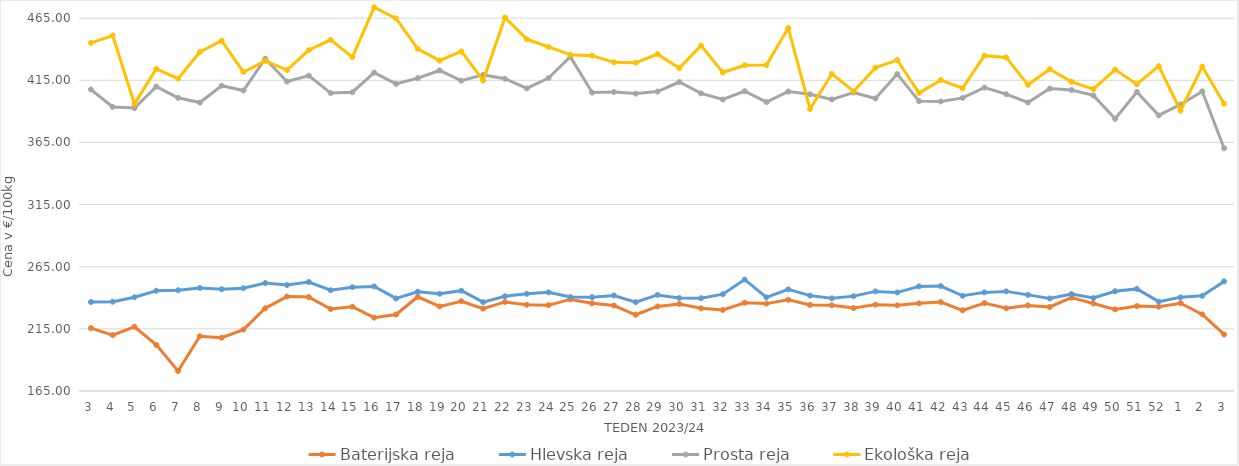
| Category | Baterijska reja | Hlevska reja | Prosta reja | Ekološka reja |
|---|---|---|---|---|
| 3.0 | 215.63 | 236.58 | 407.61 | 445.17 |
| 4.0 | 210 | 236.85 | 393.58 | 451.04 |
| 5.0 | 216.7 | 240.42 | 392.67 | 396.03 |
| 6.0 | 202.1 | 245.67 | 409.97 | 424.14 |
| 7.0 | 181.11 | 246.12 | 400.94 | 416.38 |
| 8.0 | 209.08 | 247.88 | 397.11 | 437.76 |
| 9.0 | 207.87 | 246.89 | 410.64 | 446.9 |
| 10.0 | 214.42 | 247.73 | 406.8 | 421.72 |
| 11.0 | 231.56 | 251.88 | 432.34 | 430.69 |
| 12.0 | 240.97 | 250.3 | 414 | 423.28 |
| 13.0 | 240.55 | 252.7 | 418.74 | 439.31 |
| 14.0 | 230.99 | 246.12 | 404.72 | 447.59 |
| 15.0 | 232.82 | 248.56 | 405.42 | 433.62 |
| 16.0 | 224 | 249.17 | 421.22 | 473.79 |
| 17.0 | 226.57 | 239.5 | 412.13 | 464.83 |
| 18.0 | 240.83 | 244.89 | 416.74 | 440.35 |
| 19.0 | 233.05 | 243.26 | 422.93 | 430.86 |
| 20.0 | 237.25 | 245.73 | 414.68 | 438.28 |
| 21.0 | 231.3 | 236.5 | 419.36 | 414.83 |
| 22.0 | 236.67 | 241.27 | 416.27 | 465.52 |
| 23.0 | 234.39 | 243.16 | 408.53 | 448.1 |
| 24.0 | 234.08 | 244.37 | 416.78 | 441.9 |
| 25.0 | 238.69 | 240.6 | 434.05 | 435.52 |
| 26.0 | 235.57 | 240.51 | 405.15 | 434.83 |
| 27.0 | 233.75 | 241.89 | 405.58 | 429.48 |
| 28.0 | 226.35 | 236.46 | 404.32 | 429.14 |
| 29.0 | 233.03 | 242.31 | 405.96 | 436.04 |
| 30.0 | 235 | 239.8 | 413.63 | 424.83 |
| 31.0 | 231.55 | 239.67 | 404.46 | 442.93 |
| 32.0 | 230.2 | 242.89 | 399.57 | 421.38 |
| 33.0 | 236.04 | 254.68 | 406.23 | 427.07 |
| 34.0 | 235.32 | 240.35 | 397.45 | 427.24 |
| 35.0 | 238.39 | 246.82 | 406 | 457.07 |
| 36.0 | 234.27 | 241.75 | 403.79 | 392.07 |
| 37.0 | 234 | 239.58 | 399.61 | 420.17 |
| 38.0 | 231.74 | 241.34 | 405.14 | 406.21 |
| 39.0 | 234.5 | 245.15 | 400.39 | 425.17 |
| 40.0 | 233.92 | 244.29 | 420.04 | 431.38 |
| 41.0 | 235.54 | 249.18 | 398.28 | 404.83 |
| 42.0 | 236.54 | 249.42 | 398.03 | 415.17 |
| 43.0 | 229.92 | 241.62 | 400.86 | 408.62 |
| 44.0 | 235.77 | 244.36 | 409.1 | 434.83 |
| 45.0 | 231.6 | 245.16 | 403.86 | 433.45 |
| 46.0 | 233.89 | 242.36 | 397.17 | 411.38 |
| 47.0 | 232.62 | 239.48 | 408.34 | 423.97 |
| 48.0 | 240.11 | 243.04 | 407.25 | 413.79 |
| 49.0 | 235.41 | 239.81 | 402.87 | 407.93 |
| 50.0 | 230.65 | 245.3 | 384.02 | 423.62 |
| 51.0 | 233.3 | 247.16 | 405.6 | 411.9 |
| 52.0 | 232.85 | 236.91 | 386.82 | 426.38 |
| 1.0 | 235.66 | 240.38 | 395.59 | 390.69 |
| 2.0 | 226.65 | 241.59 | 406.11 | 426.03 |
| 3.0 | 210.5 | 253.21 | 360.35 | 396.21 |